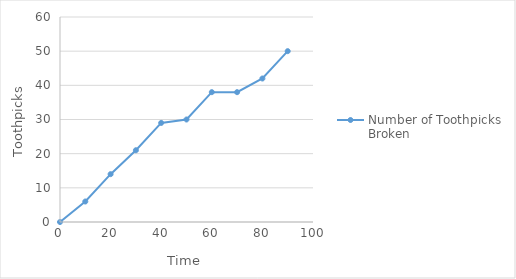
| Category | Number of Toothpicks Broken |
|---|---|
| 0.0 | 0 |
| 10.0 | 6 |
| 20.0 | 14 |
| 30.0 | 21 |
| 40.0 | 29 |
| 50.0 | 30 |
| 60.0 | 38 |
| 70.0 | 38 |
| 80.0 | 42 |
| 90.0 | 50 |